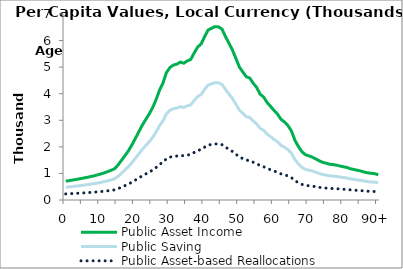
| Category | Public Asset Income | Public Saving | Public Asset-based Reallocations |
|---|---|---|---|
| 0 | 707.79 | 478.856 | 228.934 |
|  | 729.672 | 493.66 | 236.012 |
| 2 | 751.554 | 508.465 | 243.089 |
| 3 | 773.436 | 523.269 | 250.167 |
| 4 | 797.053 | 539.247 | 257.806 |
| 5 | 821.814 | 555.999 | 265.815 |
| 6 | 848.455 | 574.023 | 274.432 |
| 7 | 876.909 | 593.274 | 283.635 |
| 8 | 904.474 | 611.923 | 292.551 |
| 9 | 938.224 | 634.757 | 303.468 |
| 10 | 976.397 | 660.582 | 315.815 |
| 11 | 1017.484 | 688.38 | 329.104 |
| 12 | 1064.221 | 720 | 344.221 |
| 13 | 1114.864 | 754.262 | 360.602 |
| 14 | 1172.744 | 793.421 | 379.323 |
| 15 | 1306.125 | 883.66 | 422.465 |
| 16 | 1482.435 | 1002.943 | 479.492 |
| 17 | 1659.249 | 1122.567 | 536.682 |
| 18 | 1839.117 | 1244.257 | 594.861 |
| 19 | 2061.716 | 1394.856 | 666.86 |
| 20 | 2304.287 | 1558.968 | 745.319 |
| 21 | 2554.248 | 1728.079 | 826.169 |
| 22 | 2804.716 | 1897.534 | 907.182 |
| 23 | 3020.647 | 2043.622 | 977.025 |
| 24 | 3231.129 | 2186.024 | 1045.105 |
| 25 | 3471.51 | 2348.654 | 1122.856 |
| 26 | 3772.142 | 2552.047 | 1220.096 |
| 27 | 4131.752 | 2795.341 | 1336.411 |
| 28 | 4399.141 | 2976.243 | 1422.898 |
| 29 | 4796.03 | 3244.759 | 1551.271 |
| 30 | 4984.371 | 3372.181 | 1612.19 |
| 31 | 5078.083 | 3435.583 | 1642.501 |
| 32 | 5113.125 | 3459.29 | 1653.835 |
| 33 | 5190.197 | 3511.433 | 1678.764 |
| 34 | 5146.499 | 3481.869 | 1664.63 |
| 35 | 5234.201 | 3541.204 | 1692.997 |
| 36 | 5290.668 | 3579.407 | 1711.261 |
| 37 | 5536.65 | 3745.826 | 1790.824 |
| 38 | 5757.209 | 3895.046 | 1862.163 |
| 39 | 5872.035 | 3972.731 | 1899.304 |
| 40 | 6149.893 | 4160.717 | 1989.177 |
| 41 | 6398.221 | 4328.723 | 2069.498 |
| 42 | 6463.04 | 4372.576 | 2090.464 |
| 43 | 6525.604 | 4414.904 | 2110.7 |
| 44 | 6515.1 | 4407.797 | 2107.302 |
| 45 | 6432.432 | 4351.869 | 2080.564 |
| 46 | 6150.101 | 4160.857 | 1989.244 |
| 47 | 5900.704 | 3992.127 | 1908.577 |
| 48 | 5647.77 | 3821.005 | 1826.765 |
| 49 | 5328.389 | 3604.927 | 1723.462 |
| 50 | 5003.858 | 3385.365 | 1618.493 |
| 51 | 4817.489 | 3259.277 | 1558.212 |
| 52 | 4637.841 | 3137.736 | 1500.105 |
| 53 | 4589.739 | 3105.192 | 1484.546 |
| 54 | 4393.519 | 2972.44 | 1421.079 |
| 55 | 4231.067 | 2862.533 | 1368.534 |
| 56 | 3980.536 | 2693.035 | 1287.5 |
| 57 | 3872.589 | 2620.004 | 1252.585 |
| 58 | 3668.353 | 2481.828 | 1186.525 |
| 59 | 3519.286 | 2380.977 | 1138.309 |
| 60 | 3369.575 | 2279.69 | 1089.886 |
| 61 | 3231.695 | 2186.407 | 1045.288 |
| 62 | 3036.69 | 2054.476 | 982.214 |
| 63 | 2937.869 | 1987.618 | 950.251 |
| 64 | 2799.407 | 1893.942 | 905.465 |
| 65 | 2598.704 | 1758.156 | 840.548 |
| 66 | 2247.492 | 1520.543 | 726.949 |
| 67 | 2011.604 | 1360.953 | 650.651 |
| 68 | 1820.314 | 1231.535 | 588.779 |
| 69 | 1705.241 | 1153.683 | 551.558 |
| 70 | 1661.296 | 1123.952 | 537.344 |
| 71 | 1613.746 | 1091.782 | 521.965 |
| 72 | 1545.046 | 1045.303 | 499.744 |
| 73 | 1476.103 | 998.659 | 477.444 |
| 74 | 1416.608 | 958.408 | 458.2 |
| 75 | 1384.455 | 936.655 | 447.801 |
| 76 | 1345.752 | 910.47 | 435.282 |
| 77 | 1333.176 | 901.962 | 431.214 |
| 78 | 1309.551 | 885.978 | 423.573 |
| 79 | 1277.765 | 864.473 | 413.292 |
| 80 | 1249.527 | 845.369 | 404.158 |
| 81 | 1223.979 | 828.084 | 395.895 |
| 82 | 1174.386 | 794.532 | 379.854 |
| 83 | 1147.431 | 776.296 | 371.136 |
| 84 | 1117.437 | 756.003 | 361.434 |
| 85 | 1089.227 | 736.918 | 352.309 |
| 86 | 1050.184 | 710.503 | 339.681 |
| 87 | 1022.353 | 691.674 | 330.679 |
| 88 | 1004.446 | 679.559 | 324.887 |
| 89 | 990.572 | 670.172 | 320.399 |
| 90+ | 948.839 | 641.938 | 306.901 |